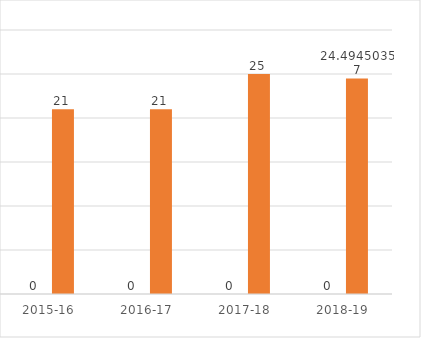
| Category | Series 0 | Series 1 |
|---|---|---|
| 2015-16 |  | 21 |
| 2016-17 |  | 21 |
| 2017-18 |  | 25 |
| 2018-19 |  | 24.495 |